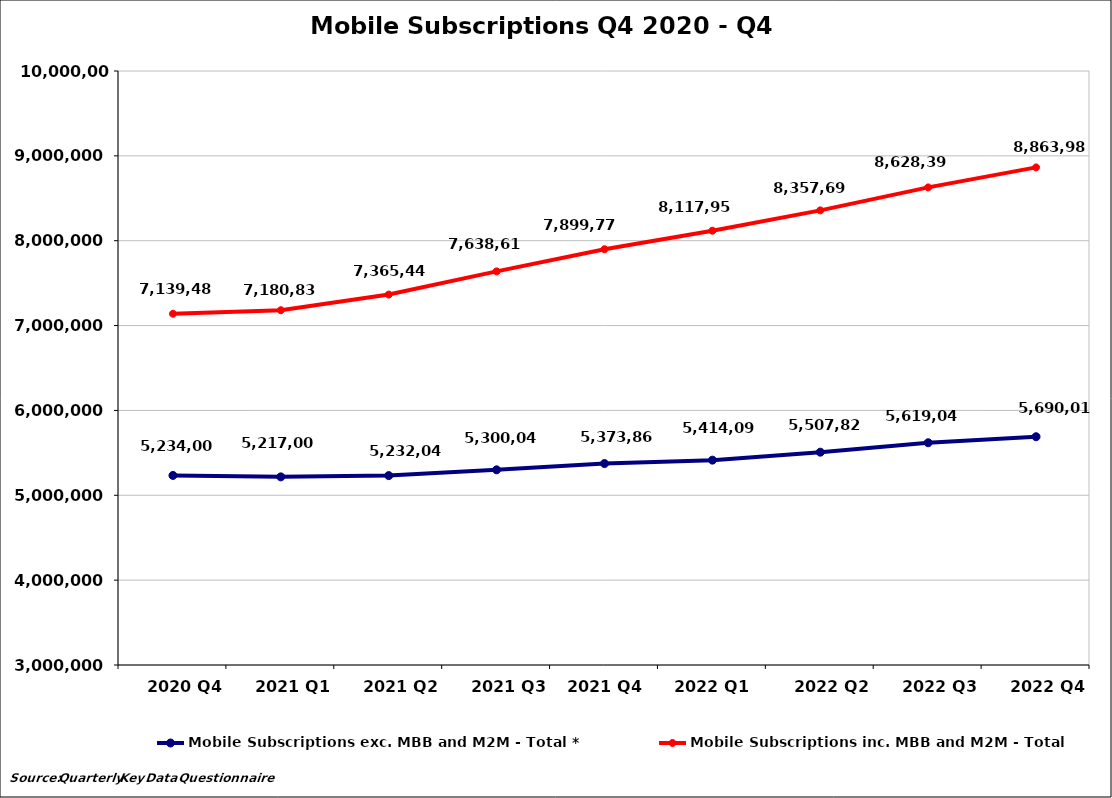
| Category | Mobile Subscriptions exc. MBB and M2M - Total * | Mobile Subscriptions inc. MBB and M2M - Total |
|---|---|---|
| 2020 Q4 | 5234009 | 7139486 |
| 2021 Q1 | 5217004 | 7180831 |
| 2021 Q2 | 5232047 | 7365441 |
| 2021 Q3 | 5300048 | 7638611 |
| 2021 Q4  | 5373865 | 7899776 |
| 2022 Q1  | 5414091 | 8117950 |
| 2022 Q2 | 5507826 | 8357695 |
| 2022 Q3 | 5619047 | 8628393 |
| 2022 Q4 | 5690017 | 8863983 |